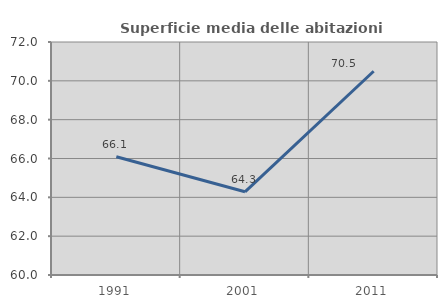
| Category | Superficie media delle abitazioni occupate |
|---|---|
| 1991.0 | 66.093 |
| 2001.0 | 64.286 |
| 2011.0 | 70.495 |